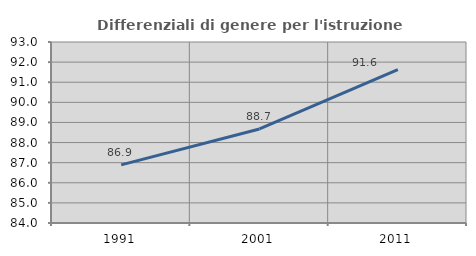
| Category | Differenziali di genere per l'istruzione superiore |
|---|---|
| 1991.0 | 86.89 |
| 2001.0 | 88.675 |
| 2011.0 | 91.621 |